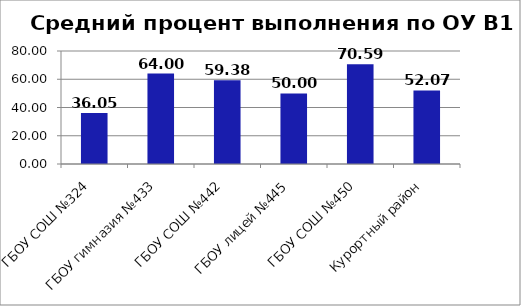
| Category | B1 |
|---|---|
| ГБОУ СОШ №324 | 36.047 |
| ГБОУ гимназия №433 | 64 |
| ГБОУ СОШ №442 | 59.375 |
| ГБОУ лицей №445 | 50 |
| ГБОУ СОШ №450 | 70.588 |
| Курортный район | 52.066 |